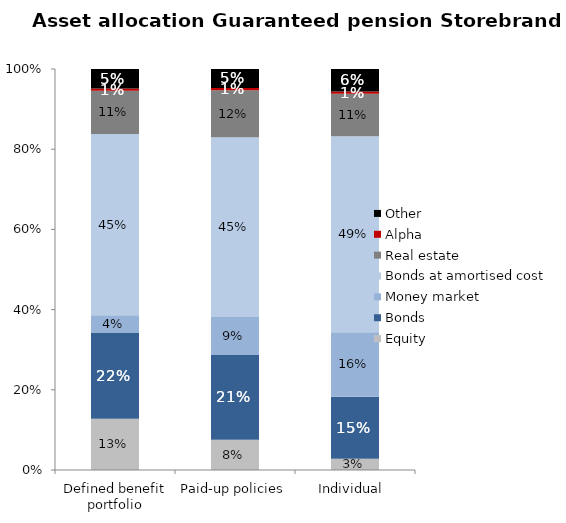
| Category | Equity | Bonds | Money market | Bonds at amortised cost | Real estate | Alpha | Other |
|---|---|---|---|---|---|---|---|
| Defined benefit portfolio | 0.128 | 0.215 | 0.043 | 0.452 | 0.108 | 0.006 | 0.049 |
| Paid-up policies | 0.076 | 0.211 | 0.095 | 0.448 | 0.117 | 0.006 | 0.047 |
| Individual  | 0.028 | 0.155 | 0.161 | 0.489 | 0.106 | 0.006 | 0.056 |